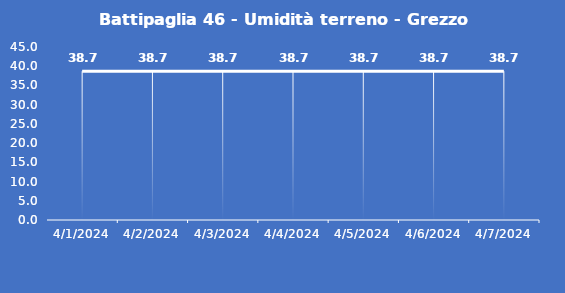
| Category | Battipaglia 46 - Umidità terreno - Grezzo (%VWC) |
|---|---|
| 4/1/24 | 38.7 |
| 4/2/24 | 38.7 |
| 4/3/24 | 38.7 |
| 4/4/24 | 38.7 |
| 4/5/24 | 38.7 |
| 4/6/24 | 38.7 |
| 4/7/24 | 38.7 |